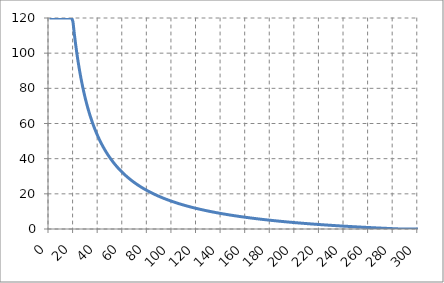
| Category | Snelheid |
|---|---|
| 0.0 | 120 |
| 1.0 | 120 |
| 2.0 | 120 |
| 3.0 | 120 |
| 4.0 | 120 |
| 5.0 | 120 |
| 6.0 | 120 |
| 7.0 | 120 |
| 8.0 | 120 |
| 9.0 | 120 |
| 10.0 | 120 |
| 11.0 | 120 |
| 12.0 | 120 |
| 13.0 | 120 |
| 14.0 | 120 |
| 15.0 | 120 |
| 16.0 | 120 |
| 17.0 | 120 |
| 18.0 | 120 |
| 19.0 | 117.916 |
| 20.0 | 111.6 |
| 21.0 | 105.886 |
| 22.0 | 100.691 |
| 23.0 | 95.948 |
| 24.0 | 91.6 |
| 25.0 | 87.6 |
| 26.0 | 83.908 |
| 27.0 | 80.489 |
| 28.0 | 77.314 |
| 29.0 | 74.359 |
| 30.0 | 71.6 |
| 31.0 | 69.019 |
| 32.0 | 66.6 |
| 33.0 | 64.327 |
| 34.0 | 62.188 |
| 35.0 | 60.171 |
| 36.0 | 58.267 |
| 37.0 | 56.465 |
| 38.0 | 54.758 |
| 39.0 | 53.138 |
| 40.0 | 51.6 |
| 41.0 | 50.137 |
| 42.0 | 48.743 |
| 43.0 | 47.414 |
| 44.0 | 46.145 |
| 45.0 | 44.933 |
| 46.0 | 43.774 |
| 47.0 | 42.664 |
| 48.0 | 41.6 |
| 49.0 | 40.58 |
| 50.0 | 39.6 |
| 51.0 | 38.659 |
| 52.0 | 37.754 |
| 53.0 | 36.883 |
| 54.0 | 36.044 |
| 55.0 | 35.236 |
| 56.0 | 34.457 |
| 57.0 | 33.705 |
| 58.0 | 32.979 |
| 59.0 | 32.278 |
| 60.0 | 31.6 |
| 61.0 | 30.944 |
| 62.0 | 30.31 |
| 63.0 | 29.695 |
| 64.0 | 29.1 |
| 65.0 | 28.523 |
| 66.0 | 27.964 |
| 67.0 | 27.421 |
| 68.0 | 26.894 |
| 69.0 | 26.383 |
| 70.0 | 25.886 |
| 71.0 | 25.403 |
| 72.0 | 24.933 |
| 73.0 | 24.477 |
| 74.0 | 24.032 |
| 75.0 | 23.6 |
| 76.0 | 23.179 |
| 77.0 | 22.769 |
| 78.0 | 22.369 |
| 79.0 | 21.98 |
| 80.0 | 21.6 |
| 81.0 | 21.23 |
| 82.0 | 20.868 |
| 83.0 | 20.516 |
| 84.0 | 20.171 |
| 85.0 | 19.835 |
| 86.0 | 19.507 |
| 87.0 | 19.186 |
| 88.0 | 18.873 |
| 89.0 | 18.566 |
| 90.0 | 18.267 |
| 91.0 | 17.974 |
| 92.0 | 17.687 |
| 93.0 | 17.406 |
| 94.0 | 17.132 |
| 95.0 | 16.863 |
| 96.0 | 16.6 |
| 97.0 | 16.342 |
| 98.0 | 16.09 |
| 99.0 | 15.842 |
| 100.0 | 15.6 |
| 101.0 | 15.362 |
| 102.0 | 15.129 |
| 103.0 | 14.901 |
| 104.0 | 14.677 |
| 105.0 | 14.457 |
| 106.0 | 14.242 |
| 107.0 | 14.03 |
| 108.0 | 13.822 |
| 109.0 | 13.618 |
| 110.0 | 13.418 |
| 111.0 | 13.222 |
| 112.0 | 13.029 |
| 113.0 | 12.839 |
| 114.0 | 12.653 |
| 115.0 | 12.47 |
| 116.0 | 12.29 |
| 117.0 | 12.113 |
| 118.0 | 11.939 |
| 119.0 | 11.768 |
| 120.0 | 11.6 |
| 121.0 | 11.435 |
| 122.0 | 11.272 |
| 123.0 | 11.112 |
| 124.0 | 10.955 |
| 125.0 | 10.8 |
| 126.0 | 10.648 |
| 127.0 | 10.498 |
| 128.0 | 10.35 |
| 129.0 | 10.205 |
| 130.0 | 10.062 |
| 131.0 | 9.921 |
| 132.0 | 9.782 |
| 133.0 | 9.645 |
| 134.0 | 9.51 |
| 135.0 | 9.378 |
| 136.0 | 9.247 |
| 137.0 | 9.118 |
| 138.0 | 8.991 |
| 139.0 | 8.866 |
| 140.0 | 8.743 |
| 141.0 | 8.621 |
| 142.0 | 8.501 |
| 143.0 | 8.383 |
| 144.0 | 8.267 |
| 145.0 | 8.152 |
| 146.0 | 8.038 |
| 147.0 | 7.927 |
| 148.0 | 7.816 |
| 149.0 | 7.707 |
| 150.0 | 7.6 |
| 151.0 | 7.494 |
| 152.0 | 7.389 |
| 153.0 | 7.286 |
| 154.0 | 7.184 |
| 155.0 | 7.084 |
| 156.0 | 6.985 |
| 157.0 | 6.887 |
| 158.0 | 6.79 |
| 159.0 | 6.694 |
| 160.0 | 6.6 |
| 161.0 | 6.507 |
| 162.0 | 6.415 |
| 163.0 | 6.324 |
| 164.0 | 6.234 |
| 165.0 | 6.145 |
| 166.0 | 6.058 |
| 167.0 | 5.971 |
| 168.0 | 5.886 |
| 169.0 | 5.801 |
| 170.0 | 5.718 |
| 171.0 | 5.635 |
| 172.0 | 5.553 |
| 173.0 | 5.473 |
| 174.0 | 5.393 |
| 175.0 | 5.314 |
| 176.0 | 5.236 |
| 177.0 | 5.159 |
| 178.0 | 5.083 |
| 179.0 | 5.008 |
| 180.0 | 4.933 |
| 181.0 | 4.86 |
| 182.0 | 4.787 |
| 183.0 | 4.715 |
| 184.0 | 4.643 |
| 185.0 | 4.573 |
| 186.0 | 4.503 |
| 187.0 | 4.434 |
| 188.0 | 4.366 |
| 189.0 | 4.298 |
| 190.0 | 4.232 |
| 191.0 | 4.165 |
| 192.0 | 4.1 |
| 193.0 | 4.035 |
| 194.0 | 3.971 |
| 195.0 | 3.908 |
| 196.0 | 3.845 |
| 197.0 | 3.783 |
| 198.0 | 3.721 |
| 199.0 | 3.66 |
| 200.0 | 3.6 |
| 201.0 | 3.54 |
| 202.0 | 3.481 |
| 203.0 | 3.423 |
| 204.0 | 3.365 |
| 205.0 | 3.307 |
| 206.0 | 3.25 |
| 207.0 | 3.194 |
| 208.0 | 3.138 |
| 209.0 | 3.083 |
| 210.0 | 3.029 |
| 211.0 | 2.974 |
| 212.0 | 2.921 |
| 213.0 | 2.868 |
| 214.0 | 2.815 |
| 215.0 | 2.763 |
| 216.0 | 2.711 |
| 217.0 | 2.66 |
| 218.0 | 2.609 |
| 219.0 | 2.559 |
| 220.0 | 2.509 |
| 221.0 | 2.46 |
| 222.0 | 2.411 |
| 223.0 | 2.362 |
| 224.0 | 2.314 |
| 225.0 | 2.267 |
| 226.0 | 2.219 |
| 227.0 | 2.173 |
| 228.0 | 2.126 |
| 229.0 | 2.08 |
| 230.0 | 2.035 |
| 231.0 | 1.99 |
| 232.0 | 1.945 |
| 233.0 | 1.9 |
| 234.0 | 1.856 |
| 235.0 | 1.813 |
| 236.0 | 1.769 |
| 237.0 | 1.727 |
| 238.0 | 1.684 |
| 239.0 | 1.642 |
| 240.0 | 1.6 |
| 241.0 | 1.559 |
| 242.0 | 1.517 |
| 243.0 | 1.477 |
| 244.0 | 1.436 |
| 245.0 | 1.396 |
| 246.0 | 1.356 |
| 247.0 | 1.317 |
| 248.0 | 1.277 |
| 249.0 | 1.239 |
| 250.0 | 1.2 |
| 251.0 | 1.162 |
| 252.0 | 1.124 |
| 253.0 | 1.086 |
| 254.0 | 1.049 |
| 255.0 | 1.012 |
| 256.0 | 0.975 |
| 257.0 | 0.939 |
| 258.0 | 0.902 |
| 259.0 | 0.866 |
| 260.0 | 0.831 |
| 261.0 | 0.795 |
| 262.0 | 0.76 |
| 263.0 | 0.725 |
| 264.0 | 0.691 |
| 265.0 | 0.657 |
| 266.0 | 0.623 |
| 267.0 | 0.589 |
| 268.0 | 0.555 |
| 269.0 | 0.522 |
| 270.0 | 0.489 |
| 271.0 | 0.456 |
| 272.0 | 0.424 |
| 273.0 | 0.391 |
| 274.0 | 0.359 |
| 275.0 | 0.327 |
| 276.0 | 0.296 |
| 277.0 | 0.264 |
| 278.0 | 0.233 |
| 279.0 | 0.202 |
| 280.0 | 0.171 |
| 281.0 | 0.141 |
| 282.0 | 0.111 |
| 283.0 | 0.081 |
| 284.0 | 0.051 |
| 285.0 | 0.021 |
| 286.0 | 0 |
| 287.0 | 0 |
| 288.0 | 0 |
| 289.0 | 0 |
| 290.0 | 0 |
| 291.0 | 0 |
| 292.0 | 0 |
| 293.0 | 0 |
| 294.0 | 0 |
| 295.0 | 0 |
| 296.0 | 0 |
| 297.0 | 0 |
| 298.0 | 0 |
| 299.0 | 0 |
| 300.0 | 0 |